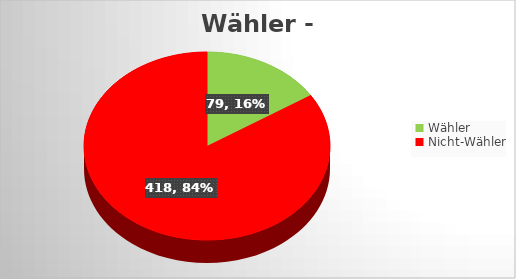
| Category | Series 0 |
|---|---|
| Wähler | 79 |
| Nicht-Wähler | 418 |